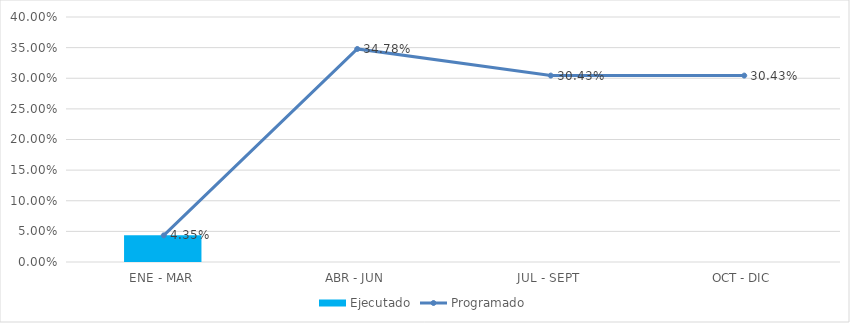
| Category | Ejecutado |
|---|---|
| ENE - MAR | 0.043 |
| ABR - JUN | 0 |
| JUL - SEPT | 0 |
| OCT - DIC | 0 |